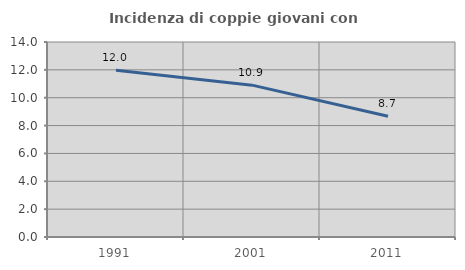
| Category | Incidenza di coppie giovani con figli |
|---|---|
| 1991.0 | 11.972 |
| 2001.0 | 10.902 |
| 2011.0 | 8.664 |